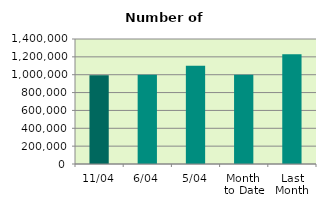
| Category | Series 0 |
|---|---|
| 11/04 | 993634 |
| 6/04 | 1000472 |
| 5/04 | 1099902 |
| Month 
to Date | 998925.2 |
| Last
Month | 1228285.652 |